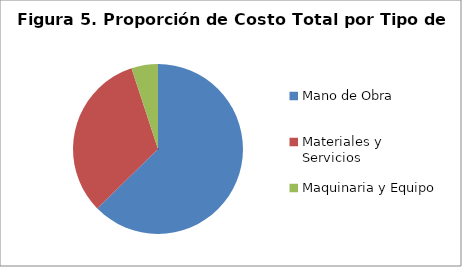
| Category | Series 0 |
|---|---|
| Mano de Obra | 95860 |
| Materiales y Servicios | 49346.4 |
| Maquinaria y Equipo | 7704 |